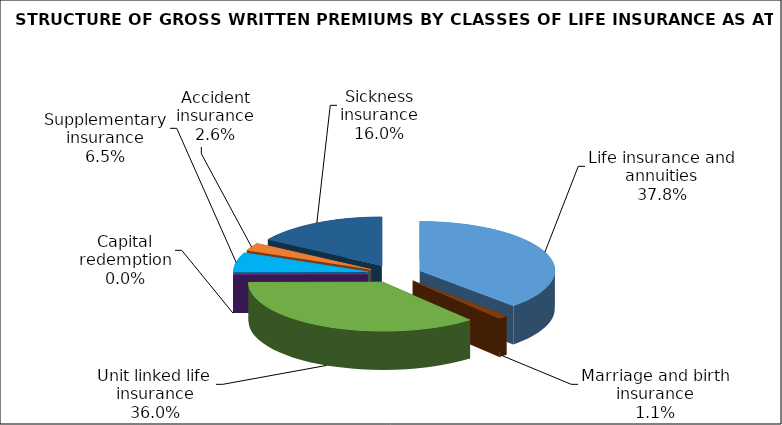
| Category | Series 0 |
|---|---|
| Life insurance and annuities | 76520558.212 |
| Marriage and birth insurance | 2279906.078 |
| Unit linked life insurance | 72869318.132 |
| Capital redemption | 0 |
| Supplementary insurance | 13108572.822 |
| Accident insurance | 5274929.19 |
| Sickness insurance | 32403324.01 |